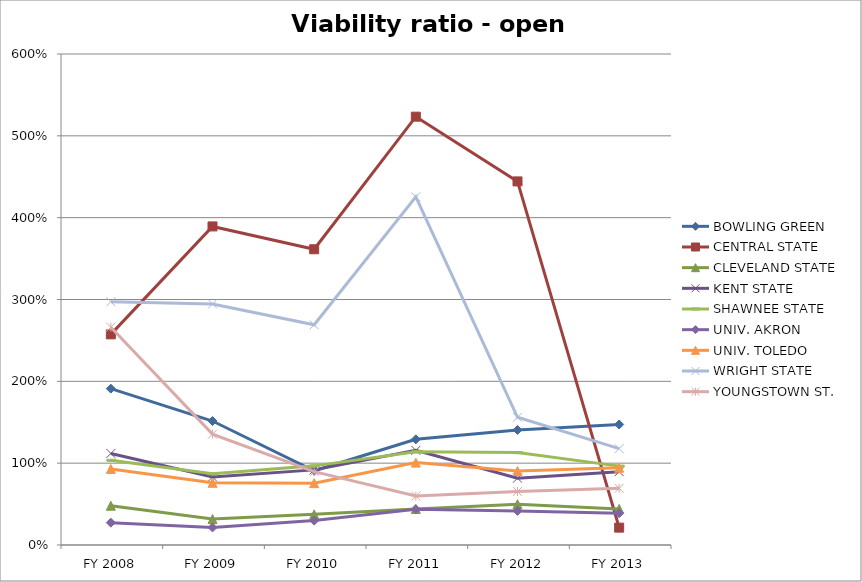
| Category | BOWLING GREEN  | CENTRAL STATE  | CLEVELAND STATE  | KENT STATE  | SHAWNEE STATE  | UNIV. AKRON  | UNIV. TOLEDO  | WRIGHT STATE  | YOUNGSTOWN ST.  |
|---|---|---|---|---|---|---|---|---|---|
| FY 2013 | 1.473 | 0.212 | 0.441 | 0.896 | 0.964 | 0.388 | 0.944 | 1.177 | 0.693 |
| FY 2012 | 1.406 | 4.443 | 0.499 | 0.817 | 1.129 | 0.417 | 0.904 | 1.561 | 0.654 |
| FY 2011 | 1.291 | 5.234 | 0.44 | 1.156 | 1.139 | 0.438 | 1.007 | 4.254 | 0.598 |
| FY 2010 | 0.907 | 3.614 | 0.375 | 0.918 | 0.967 | 0.298 | 0.756 | 2.691 | 0.896 |
| FY 2009 | 1.515 | 3.893 | 0.317 | 0.831 | 0.87 | 0.214 | 0.76 | 2.946 | 1.355 |
| FY 2008 | 1.911 | 2.574 | 0.48 | 1.119 | 1.035 | 0.273 | 0.929 | 2.973 | 2.662 |